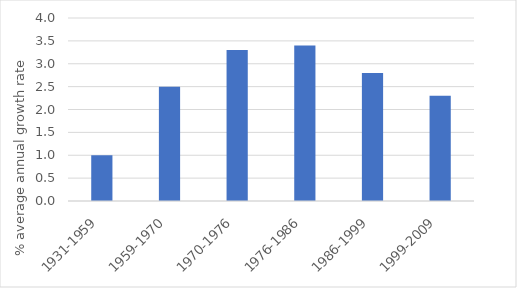
| Category | Average annual growth rate (%) |
|---|---|
| 1931-1959 | 1 |
| 1959-1970 | 2.5 |
| 1970-1976 | 3.3 |
| 1976-1986 | 3.4 |
| 1986-1999 | 2.8 |
| 1999-2009 | 2.3 |